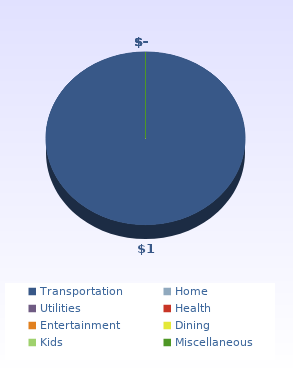
| Category | Series 2 |
|---|---|
| Transportation | 1 |
| Home | 0 |
| Utilities | 0 |
| Health | 0 |
| Entertainment | 0 |
| Dining | 0 |
| Kids | 0 |
| Miscellaneous | 0 |